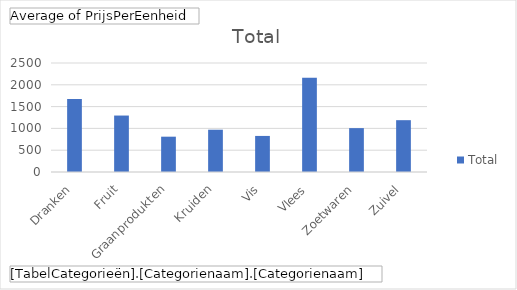
| Category | Total |
|---|---|
| Dranken | 1675 |
| Fruit | 1294.8 |
| Graanprodukten | 810 |
| Kruiden | 970 |
| Vis | 827.3 |
| Vlees | 2160.267 |
| Zoetwaren | 1006.4 |
| Zuivel | 1188.571 |